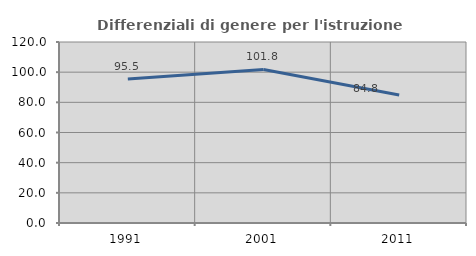
| Category | Differenziali di genere per l'istruzione superiore |
|---|---|
| 1991.0 | 95.527 |
| 2001.0 | 101.807 |
| 2011.0 | 84.802 |